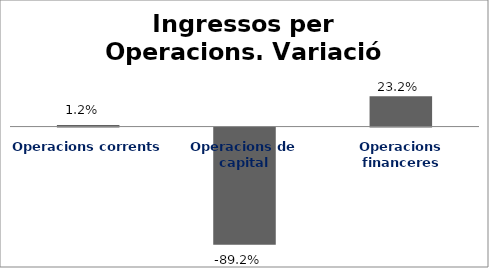
| Category | Series 0 |
|---|---|
| Operacions corrents | 0.012 |
| Operacions de capital | -0.892 |
| Operacions financeres | 0.232 |